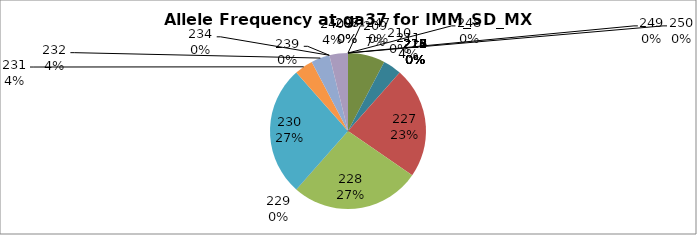
| Category | Series 0 |
|---|---|
| 207.0 | 0 |
| 208.0 | 0 |
| 209.0 | 0.077 |
| 210.0 | 0 |
| 211.0 | 0.038 |
| 212.0 | 0 |
| 213.0 | 0 |
| 214.0 | 0 |
| 215.0 | 0 |
| 216.0 | 0 |
| 217.0 | 0 |
| 218.0 | 0 |
| 226.0 | 0 |
| 227.0 | 0.231 |
| 228.0 | 0.269 |
| 229.0 | 0 |
| 230.0 | 0.269 |
| 231.0 | 0.038 |
| 232.0 | 0.038 |
| 234.0 | 0 |
| 239.0 | 0 |
| 240.0 | 0.038 |
| 247.0 | 0 |
| 248.0 | 0 |
| 249.0 | 0 |
| 250.0 | 0 |